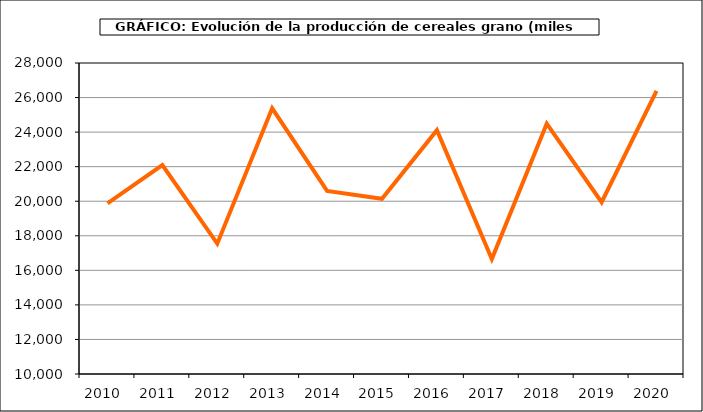
| Category | Produccion |
|---|---|
| 2010.0 | 19880.065 |
| 2011.0 | 22094.521 |
| 2012.0 | 17543.823 |
| 2013.0 | 25374.359 |
| 2014.0 | 20596.94 |
| 2015.0 | 20140.943 |
| 2016.0 | 24114.796 |
| 2017.0 | 16658.841 |
| 2018.0 | 24490.855 |
| 2019.0 | 19942.145 |
| 2020.0 | 26389.584 |